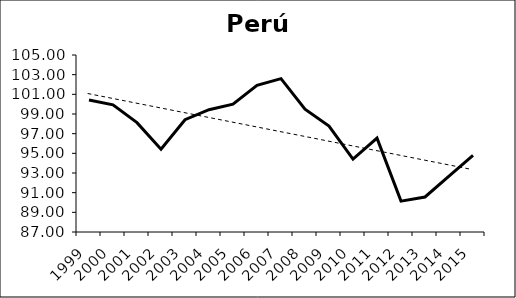
| Category | Series 0 |
|---|---|
| 1999.0 | 100.43 |
| 2000.0 | 99.93 |
| 2001.0 | 98.12 |
| 2002.0 | 95.41 |
| 2003.0 | 98.42 |
| 2004.0 | 99.44 |
| 2005.0 | 100 |
| 2006.0 | 101.91 |
| 2007.0 | 102.6 |
| 2008.0 | 99.49 |
| 2009.0 | 97.78 |
| 2010.0 | 94.42 |
| 2011.0 | 96.55 |
| 2012.0 | 90.14 |
| 2013.0 | 90.56 |
| 2014.0 | 92.68 |
| 2015.0 | 94.8 |